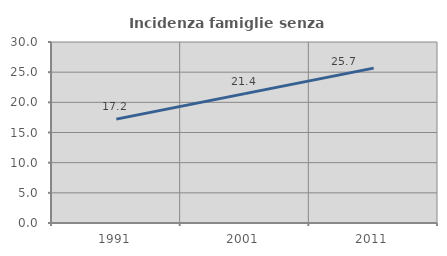
| Category | Incidenza famiglie senza nuclei |
|---|---|
| 1991.0 | 17.219 |
| 2001.0 | 21.445 |
| 2011.0 | 25.671 |